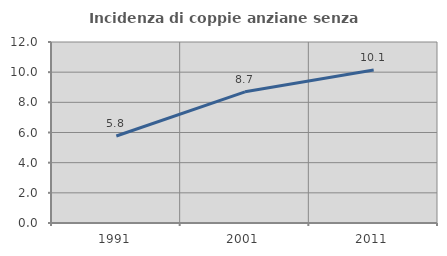
| Category | Incidenza di coppie anziane senza figli  |
|---|---|
| 1991.0 | 5.769 |
| 2001.0 | 8.696 |
| 2011.0 | 10.14 |